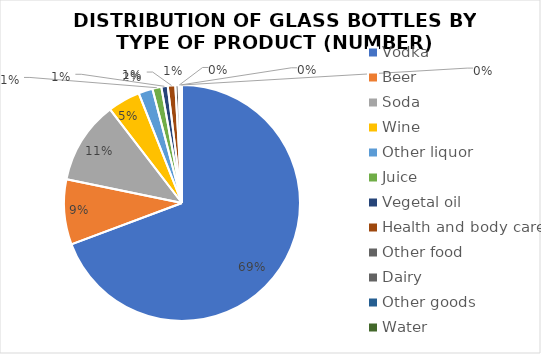
| Category | Series 0 |
|---|---|
| Vodka | 2145 |
| Beer | 276 |
| Soda | 351 |
| Wine | 138 |
| Other liquor | 60 |
| Juice | 38 |
| Vegetal oil | 27 |
| Health and body care | 32 |
| Other food | 14 |
| Dairy | 5 |
| Other goods | 4 |
| Water | 5 |